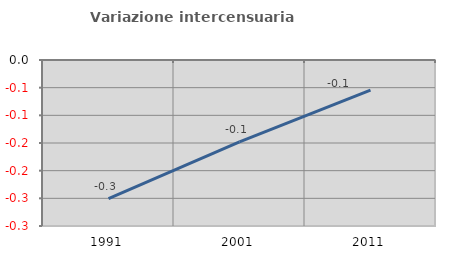
| Category | Variazione intercensuaria annua |
|---|---|
| 1991.0 | -0.251 |
| 2001.0 | -0.148 |
| 2011.0 | -0.054 |